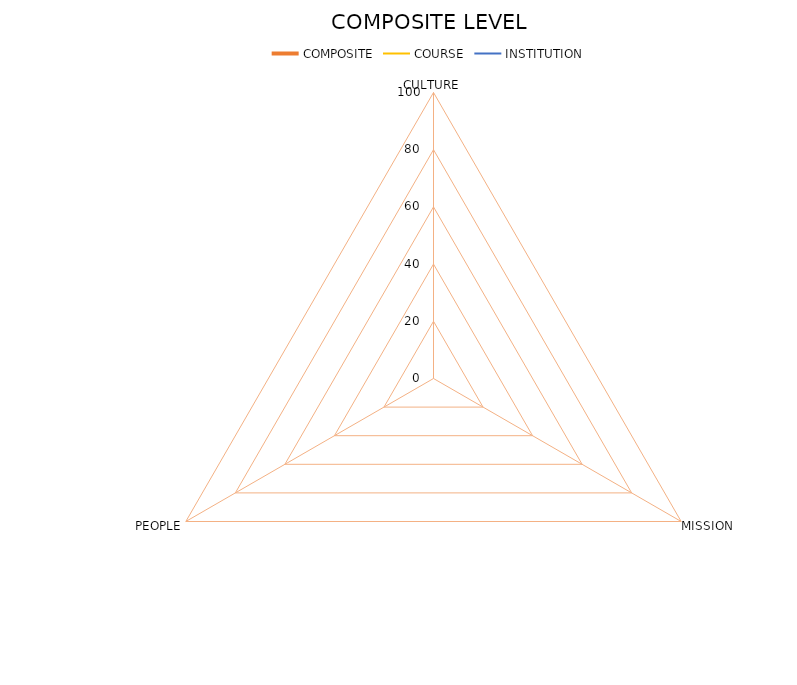
| Category | COMPOSITE | COURSE | INSTITUTION |
|---|---|---|---|
| CULTURE | 0 | 0 | 0 |
| MISSION | 0 | 0 | 0 |
| PEOPLE | 0 | 0 | 0 |